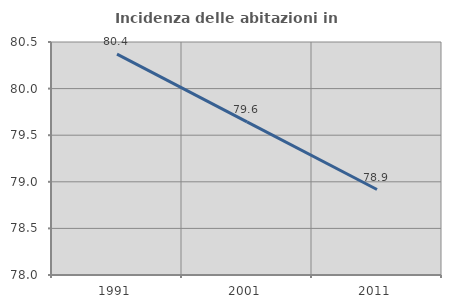
| Category | Incidenza delle abitazioni in proprietà  |
|---|---|
| 1991.0 | 80.37 |
| 2001.0 | 79.643 |
| 2011.0 | 78.917 |